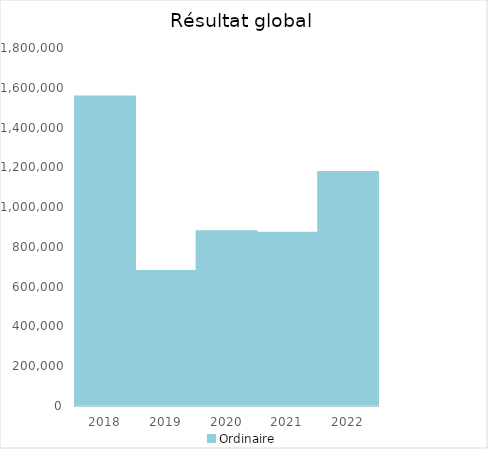
| Category |   | Ordinaire |    |
|---|---|---|---|
| 2018.0 |  | 1555552.58 |  |
| 2019.0 |  | 678967.06 |  |
| 2020.0 |  | 878465.29 |  |
| 2021.0 |  | 870956.61 |  |
| 2022.0 |  | 1176319.99 |  |